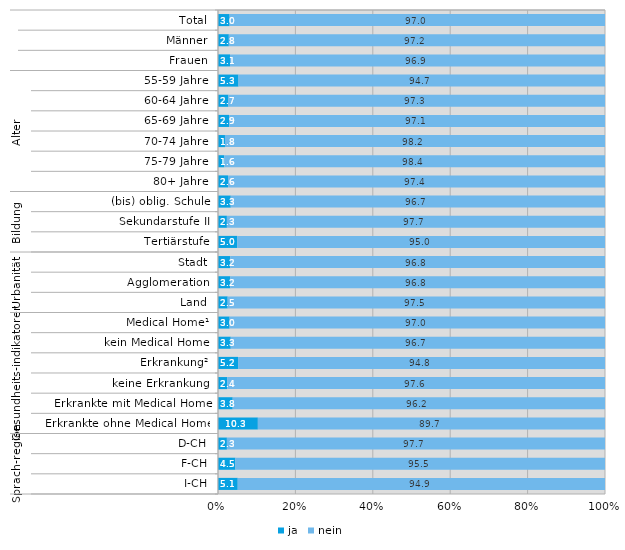
| Category | ja | nein |
|---|---|---|
| 0 | 3 | 97 |
| 1 | 2.8 | 97.2 |
| 2 | 3.1 | 96.9 |
| 3 | 5.3 | 94.7 |
| 4 | 2.7 | 97.3 |
| 5 | 2.9 | 97.1 |
| 6 | 1.8 | 98.2 |
| 7 | 1.6 | 98.4 |
| 8 | 2.6 | 97.4 |
| 9 | 3.3 | 96.7 |
| 10 | 2.3 | 97.7 |
| 11 | 5 | 95 |
| 12 | 3.2 | 96.8 |
| 13 | 3.2 | 96.8 |
| 14 | 2.5 | 97.5 |
| 15 | 3 | 97 |
| 16 | 3.3 | 96.7 |
| 17 | 5.2 | 94.8 |
| 18 | 2.4 | 97.6 |
| 19 | 3.8 | 96.2 |
| 20 | 10.3 | 89.7 |
| 21 | 2.3 | 97.7 |
| 22 | 4.5 | 95.5 |
| 23 | 5.1 | 94.9 |